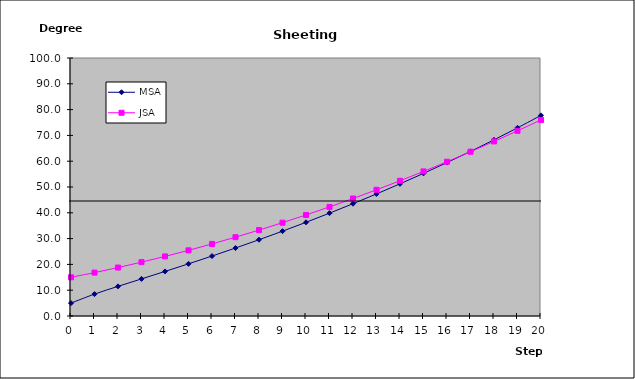
| Category | MSA | JSA |
|---|---|---|
| 0.0 | 5 | 15 |
| 1.0 | 8.485 | 16.822 |
| 2.0 | 11.488 | 18.779 |
| 3.0 | 14.381 | 20.87 |
| 4.0 | 17.274 | 23.093 |
| 5.0 | 20.217 | 25.448 |
| 6.0 | 23.237 | 27.933 |
| 7.0 | 26.348 | 30.548 |
| 8.0 | 29.56 | 33.292 |
| 9.0 | 32.879 | 36.163 |
| 10.0 | 36.31 | 39.161 |
| 11.0 | 39.856 | 42.285 |
| 12.0 | 43.522 | 45.535 |
| 13.0 | 47.312 | 48.911 |
| 14.0 | 51.228 | 52.412 |
| 15.0 | 55.277 | 56.04 |
| 16.0 | 59.463 | 59.792 |
| 17.0 | 63.795 | 63.669 |
| 18.0 | 68.28 | 67.667 |
| 19.0 | 72.932 | 71.779 |
| 20.0 | 77.763 | 75.988 |